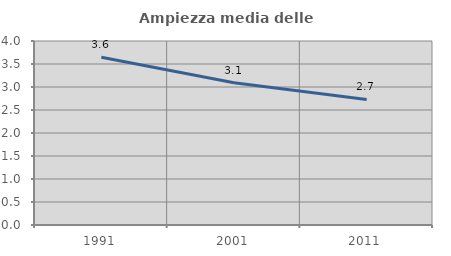
| Category | Ampiezza media delle famiglie |
|---|---|
| 1991.0 | 3.645 |
| 2001.0 | 3.093 |
| 2011.0 | 2.73 |